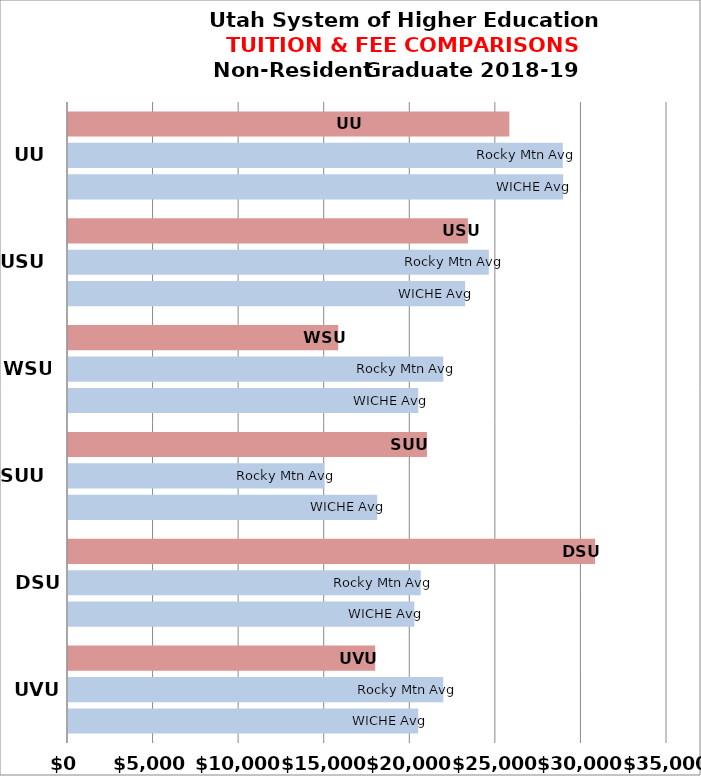
| Category | WICHE Avg | Rocky Mtn Avg | USHE Inst |
|---|---|---|---|
| UVU | 20464.1 | 21925.5 | 17950 |
| DSU | 20240.643 | 20610.857 | 30795 |
| SUU | 18069 | 14979.5 | 20974 |
| WSU | 20464.1 | 21925.5 | 15790 |
| USU | 23205.867 | 24589.111 | 23365 |
| UU | 28934.286 | 28910.625 | 25790 |